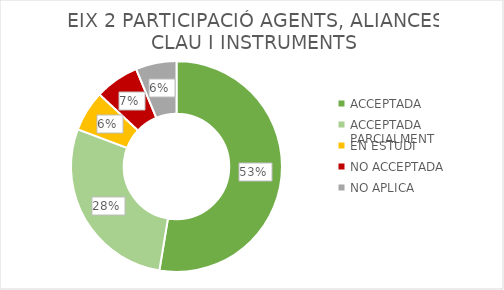
| Category | EIX 2 PARTICIPACIÓ AGENTS, ALIANCES CLAU I INSTRUMENTS |
|---|---|
| ACCEPTADA | 101 |
| ACCEPTADA PARCIALMENT | 54 |
| EN ESTUDI | 12 |
| NO ACCEPTADA | 13 |
| NO APLICA | 12 |